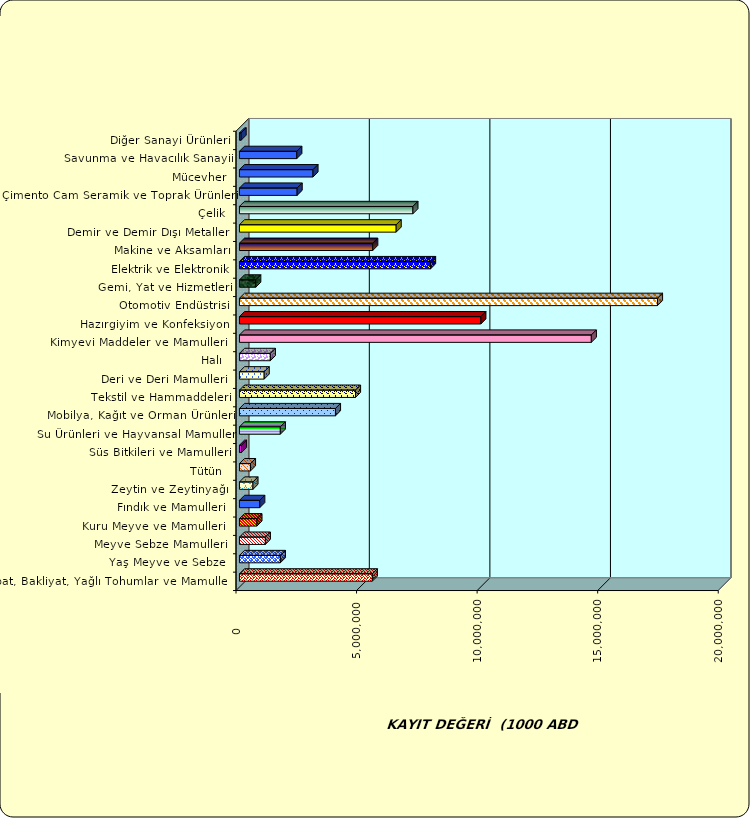
| Category | Series 0 |
|---|---|
|  Hububat, Bakliyat, Yağlı Tohumlar ve Mamulleri  | 5510942.354 |
|  Yaş Meyve ve Sebze   | 1697056.312 |
|  Meyve Sebze Mamulleri  | 1073735.657 |
|  Kuru Meyve ve Mamulleri   | 724668.862 |
|  Fındık ve Mamulleri  | 841831.633 |
|  Zeytin ve Zeytinyağı  | 559881.313 |
|  Tütün  | 456956.78 |
|  Süs Bitkileri ve Mamulleri | 85071.565 |
|  Su Ürünleri ve Hayvansal Mamuller | 1695332.448 |
|  Mobilya, Kağıt ve Orman Ürünleri | 3982101.148 |
|  Tekstil ve Hammaddeleri | 4813244.452 |
|  Deri ve Deri Mamulleri  | 1025761.12 |
|  Halı  | 1280888.179 |
|  Kimyevi Maddeler ve Mamulleri   | 14593613.579 |
|  Hazırgiyim ve Konfeksiyon  | 10010996.839 |
|  Otomotiv Endüstrisi | 17337288.147 |
|  Gemi, Yat ve Hizmetleri | 675269.241 |
|  Elektrik ve Elektronik | 7925875.4 |
|  Makine ve Aksamları | 5527984.651 |
|  Demir ve Demir Dışı Metaller  | 6498809.831 |
|  Çelik | 7193933.552 |
|  Çimento Cam Seramik ve Toprak Ürünleri | 2391794.844 |
|  Mücevher | 3049913.364 |
|  Savunma ve Havacılık Sanayii | 2378198.705 |
|  Diğer Sanayi Ürünleri | 67219.205 |